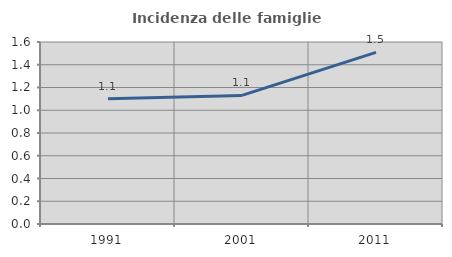
| Category | Incidenza delle famiglie numerose |
|---|---|
| 1991.0 | 1.101 |
| 2001.0 | 1.131 |
| 2011.0 | 1.509 |